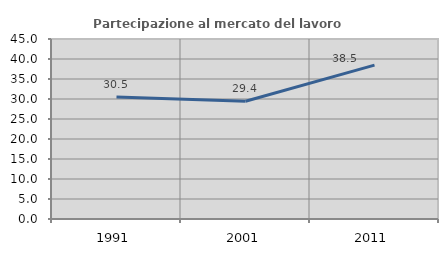
| Category | Partecipazione al mercato del lavoro  femminile |
|---|---|
| 1991.0 | 30.498 |
| 2001.0 | 29.432 |
| 2011.0 | 38.462 |